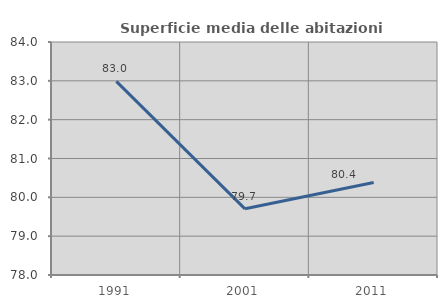
| Category | Superficie media delle abitazioni occupate |
|---|---|
| 1991.0 | 82.988 |
| 2001.0 | 79.704 |
| 2011.0 | 80.382 |